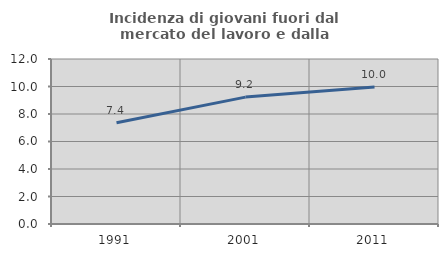
| Category | Incidenza di giovani fuori dal mercato del lavoro e dalla formazione  |
|---|---|
| 1991.0 | 7.363 |
| 2001.0 | 9.228 |
| 2011.0 | 9.962 |